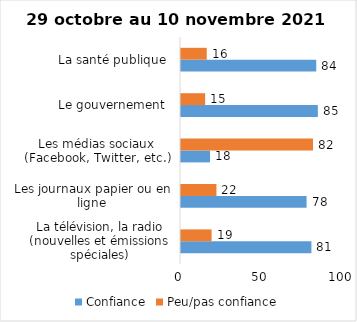
| Category | Confiance | Peu/pas confiance |
|---|---|---|
| La télévision, la radio (nouvelles et émissions spéciales) | 81 | 19 |
| Les journaux papier ou en ligne | 78 | 22 |
| Les médias sociaux (Facebook, Twitter, etc.) | 18 | 82 |
| Le gouvernement  | 85 | 15 |
| La santé publique  | 84 | 16 |